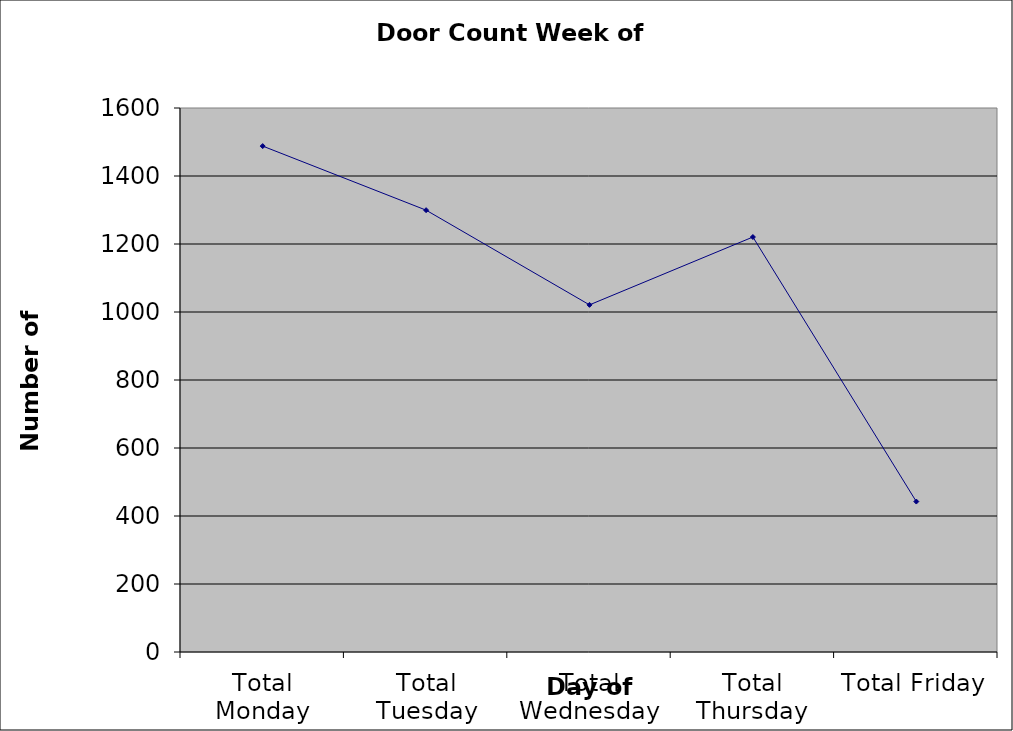
| Category | Series 0 |
|---|---|
| Total Monday | 1488 |
| Total Tuesday | 1299.5 |
| Total Wednesday | 1021 |
| Total Thursday | 1220.5 |
| Total Friday | 442.5 |